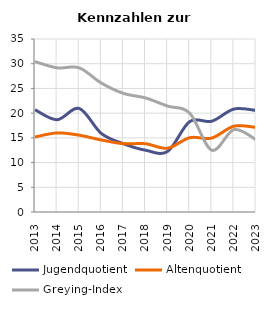
| Category | Jugendquotient | Altenquotient | Greying-Index |
|---|---|---|---|
| 2013.0 | 20.69 | 15.172 | 30.435 |
| 2014.0 | 18.667 | 16 | 29.167 |
| 2015.0 | 20.946 | 15.541 | 29.167 |
| 2016.0 | 15.894 | 14.57 | 26.087 |
| 2017.0 | 13.816 | 13.816 | 24 |
| 2018.0 | 12.5 | 13.816 | 23.077 |
| 2019.0 | 12.258 | 12.903 | 21.429 |
| 2020.0 | 18.3 | 15.03 | 20 |
| 2021.0 | 18.367 | 14.966 | 12.5 |
| 2022.0 | 20.83 | 17.36 | 16.67 |
| 2023.0 | 20.548 | 17.123 | 14.634 |